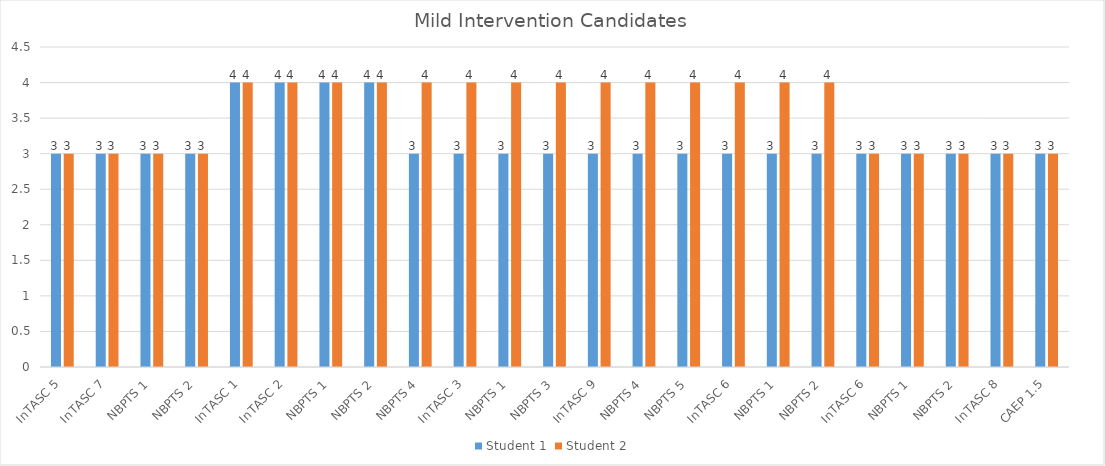
| Category | Student 1 | Student 2 |
|---|---|---|
| InTASC 5 | 3 | 3 |
| InTASC 7 | 3 | 3 |
| NBPTS 1 | 3 | 3 |
| NBPTS 2 | 3 | 3 |
| InTASC 1 | 4 | 4 |
| InTASC 2 | 4 | 4 |
| NBPTS 1 | 4 | 4 |
| NBPTS 2 | 4 | 4 |
| NBPTS 4 | 3 | 4 |
| InTASC 3 | 3 | 4 |
| NBPTS 1 | 3 | 4 |
| NBPTS 3 | 3 | 4 |
| InTASC 9 | 3 | 4 |
| NBPTS 4 | 3 | 4 |
| NBPTS 5 | 3 | 4 |
| InTASC 6 | 3 | 4 |
| NBPTS 1 | 3 | 4 |
| NBPTS 2 | 3 | 4 |
| InTASC 6 | 3 | 3 |
| NBPTS 1 | 3 | 3 |
| NBPTS 2 | 3 | 3 |
| InTASC 8 | 3 | 3 |
| CAEP 1.5 | 3 | 3 |